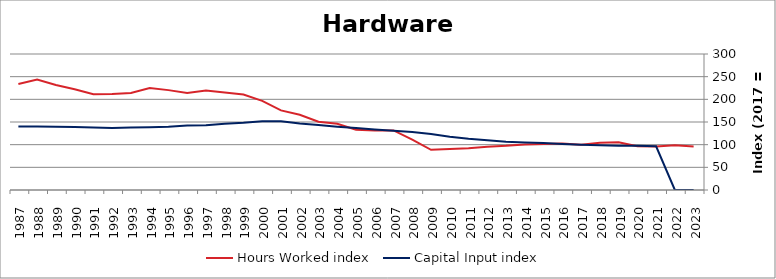
| Category | Hours Worked index | Capital Input index |
|---|---|---|
| 2023.0 | 96.077 | 0 |
| 2022.0 | 98.659 | 0 |
| 2021.0 | 95.933 | 96.389 |
| 2020.0 | 96.749 | 97.6 |
| 2019.0 | 105.527 | 97.581 |
| 2018.0 | 104.359 | 98.861 |
| 2017.0 | 100 | 100 |
| 2016.0 | 102.588 | 101.431 |
| 2015.0 | 101.388 | 103.52 |
| 2014.0 | 100.545 | 104.758 |
| 2013.0 | 97.391 | 106.585 |
| 2012.0 | 95.4 | 109.598 |
| 2011.0 | 91.974 | 113.024 |
| 2010.0 | 90.568 | 117.562 |
| 2009.0 | 88.718 | 123.717 |
| 2008.0 | 111.146 | 127.684 |
| 2007.0 | 131.505 | 130.498 |
| 2006.0 | 131.077 | 133.212 |
| 2005.0 | 132.908 | 136.569 |
| 2004.0 | 145.93 | 139.679 |
| 2003.0 | 150.621 | 143.617 |
| 2002.0 | 166.121 | 146.632 |
| 2001.0 | 175.604 | 151.413 |
| 2000.0 | 196.693 | 151.392 |
| 1999.0 | 210.572 | 148.175 |
| 1998.0 | 214.901 | 146.065 |
| 1997.0 | 219.221 | 142.704 |
| 1996.0 | 213.734 | 142.152 |
| 1995.0 | 220.301 | 139.419 |
| 1994.0 | 224.935 | 138.376 |
| 1993.0 | 214.081 | 137.746 |
| 1992.0 | 211.693 | 136.917 |
| 1991.0 | 211.024 | 137.686 |
| 1990.0 | 222.228 | 138.932 |
| 1989.0 | 231.477 | 139.474 |
| 1988.0 | 243.586 | 140.296 |
| 1987.0 | 233.749 | 140.095 |